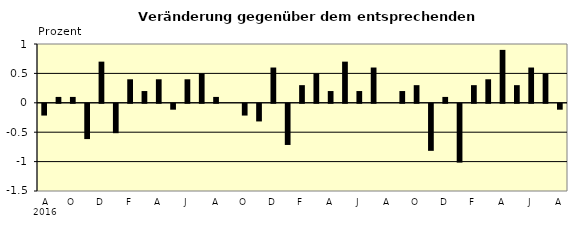
| Category | Series 0 |
|---|---|
| 0 | -0.2 |
| 1 | 0.1 |
| 2 | 0.1 |
| 3 | -0.6 |
| 4 | 0.7 |
| 5 | -0.5 |
| 6 | 0.4 |
| 7 | 0.2 |
| 8 | 0.4 |
| 9 | -0.1 |
| 10 | 0.4 |
| 11 | 0.5 |
| 12 | 0.1 |
| 13 | 0 |
| 14 | -0.2 |
| 15 | -0.3 |
| 16 | 0.6 |
| 17 | -0.7 |
| 18 | 0.3 |
| 19 | 0.5 |
| 20 | 0.2 |
| 21 | 0.7 |
| 22 | 0.2 |
| 23 | 0.6 |
| 24 | 0 |
| 25 | 0.2 |
| 26 | 0.3 |
| 27 | -0.8 |
| 28 | 0.1 |
| 29 | -1 |
| 30 | 0.3 |
| 31 | 0.4 |
| 32 | 0.9 |
| 33 | 0.3 |
| 34 | 0.6 |
| 35 | 0.5 |
| 36 | -0.1 |